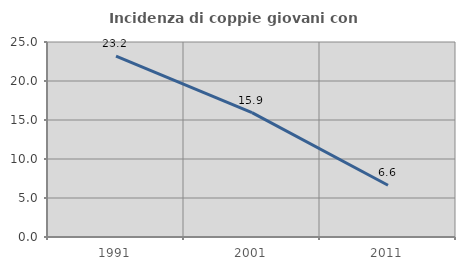
| Category | Incidenza di coppie giovani con figli |
|---|---|
| 1991.0 | 23.176 |
| 2001.0 | 15.936 |
| 2011.0 | 6.64 |